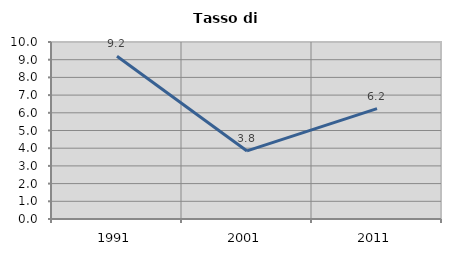
| Category | Tasso di disoccupazione   |
|---|---|
| 1991.0 | 9.198 |
| 2001.0 | 3.845 |
| 2011.0 | 6.236 |